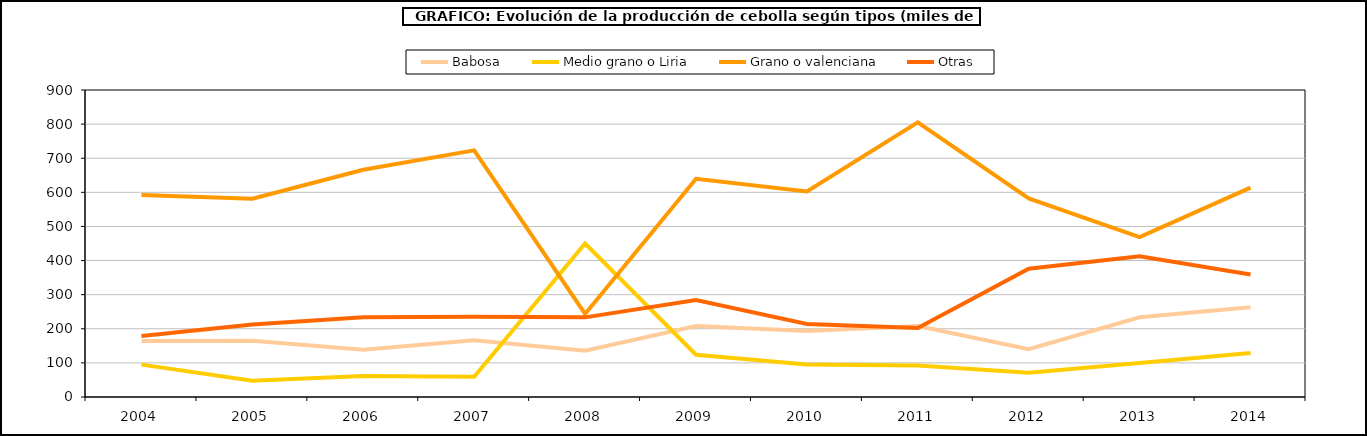
| Category | Babosa | Medio grano o Liria | Grano o valenciana | Otras |
|---|---|---|---|---|
| 2004.0 | 164.04 | 94.883 | 592.503 | 179.023 |
| 2005.0 | 164.907 | 47.447 | 581.074 | 212.623 |
| 2006.0 | 138.241 | 61.281 | 666.346 | 233.683 |
| 2007.0 | 166.457 | 59.422 | 722.921 | 235.45 |
| 2008.0 | 135.75 | 449.968 | 243.373 | 233.447 |
| 2009.0 | 208.229 | 123.904 | 639.656 | 284.499 |
| 2010.0 | 193.415 | 95.014 | 602.708 | 213.99 |
| 2011.0 | 207.933 | 92.32 | 804.939 | 202.339 |
| 2012.0 | 140.272 | 70.819 | 582.337 | 376.293 |
| 2013.0 | 233.875 | 99.562 | 468.759 | 412.305 |
| 2014.0 | 263.155 | 128.911 | 613.774 | 358.887 |